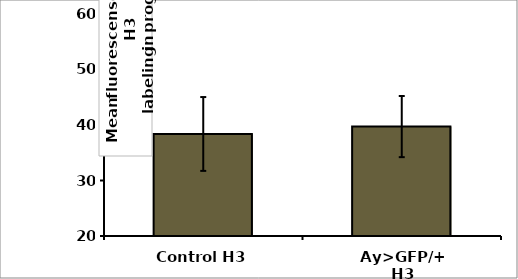
| Category | Series 0 |
|---|---|
| Control H3 | 38.384 |
| Ay>GFP/+ H3 | 39.715 |